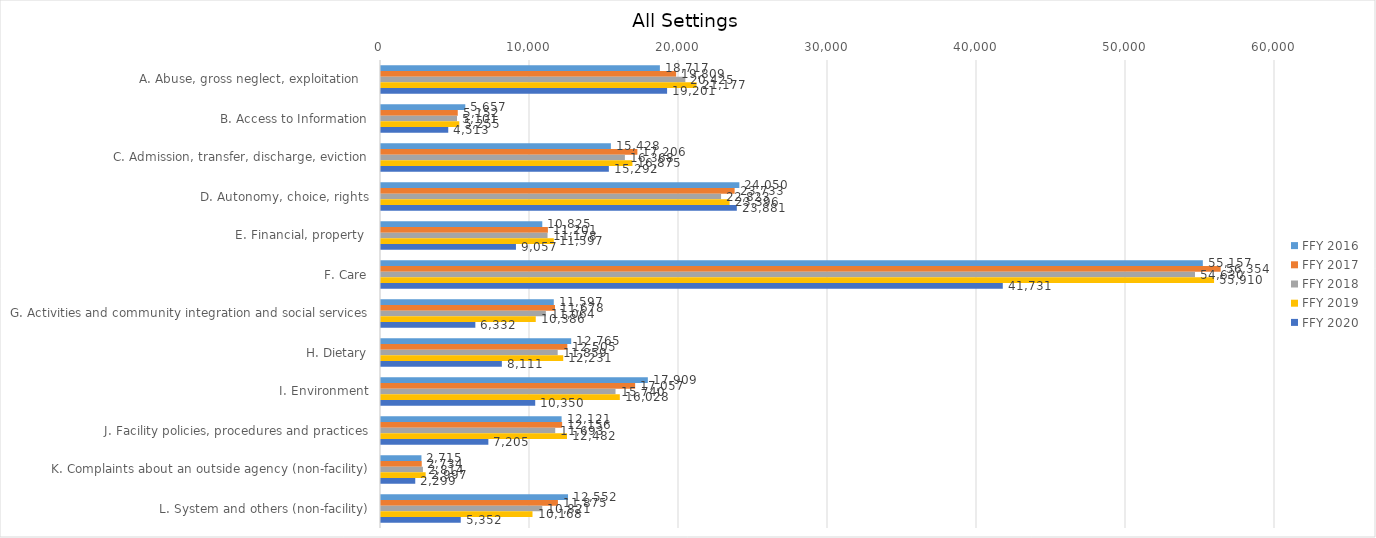
| Category | FFY 2016 | FFY 2017 | FFY 2018 | FFY 2019 | FFY 2020 |
|---|---|---|---|---|---|
| A. Abuse, gross neglect, exploitation   | 18717 | 19809 | 20425 | 21177 | 19201 |
| B. Access to Information | 5657 | 5152 | 5101 | 5255 | 4513 |
| C. Admission, transfer, discharge, eviction | 15428 | 17206 | 16368 | 16875 | 15292 |
| D. Autonomy, choice, rights | 24050 | 23733 | 22823 | 23396 | 23881 |
| E. Financial, property  | 10825 | 11201 | 11178 | 11597 | 9057 |
| F. Care | 55157 | 56354 | 54630 | 55910 | 41731 |
| G. Activities and community integration and social services | 11597 | 11678 | 11064 | 10386 | 6332 |
| H. Dietary | 12765 | 12505 | 11859 | 12231 | 8111 |
| I. Environment | 17909 | 17057 | 15740 | 16028 | 10350 |
| J. Facility policies, procedures and practices | 12121 | 12156 | 11693 | 12482 | 7205 |
| K. Complaints about an outside agency (non-facility) | 2715 | 2734 | 2814 | 2997 | 2299 |
| L. System and others (non-facility) | 12552 | 11875 | 10821 | 10168 | 5352 |